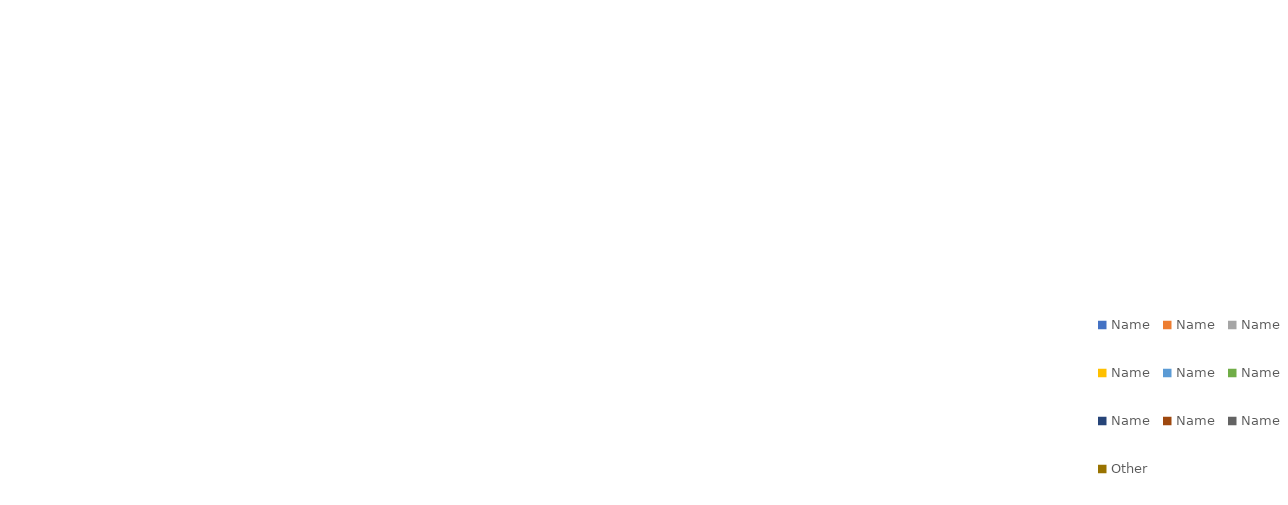
| Category | ENGAGEMENT |
|---|---|
| Name | 0 |
| Name | 0 |
| Name | 0 |
| Name | 0 |
| Name | 0 |
| Name | 0 |
| Name | 0 |
| Name | 0 |
| Name | 0 |
| Other | 0 |